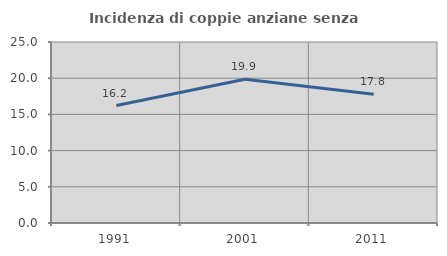
| Category | Incidenza di coppie anziane senza figli  |
|---|---|
| 1991.0 | 16.219 |
| 2001.0 | 19.852 |
| 2011.0 | 17.797 |